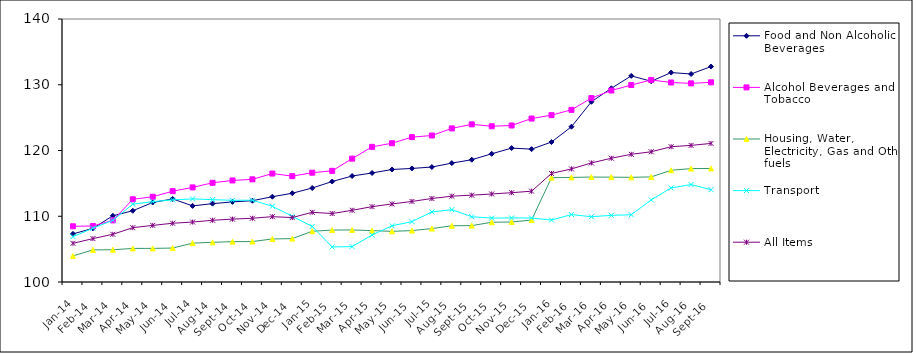
| Category | Food and Non Alcoholic Beverages | Alcohol Beverages and Tobacco | Housing, Water, Electricity, Gas and Other fuels | Transport | All Items  |
|---|---|---|---|---|---|
| 2014-01-01 | 107.321 | 108.474 | 103.967 | 106.895 | 105.878 |
| 2014-02-01 | 108.156 | 108.519 | 104.883 | 108.18 | 106.601 |
| 2014-03-01 | 110.07 | 109.373 | 104.905 | 109.388 | 107.257 |
| 2014-04-01 | 110.836 | 112.583 | 105.106 | 111.837 | 108.264 |
| 2014-05-01 | 112.095 | 112.965 | 105.114 | 112.218 | 108.608 |
| 2014-06-01 | 112.634 | 113.813 | 105.162 | 112.502 | 108.936 |
| 2014-07-01 | 111.577 | 114.387 | 105.914 | 112.638 | 109.117 |
| 2014-08-01 | 111.915 | 115.087 | 106.036 | 112.525 | 109.391 |
| 2014-09-01 | 112.185 | 115.445 | 106.136 | 112.42 | 109.563 |
| 2014-10-01 | 112.363 | 115.614 | 106.151 | 112.444 | 109.694 |
| 2014-11-01 | 112.971 | 116.497 | 106.547 | 111.515 | 109.94 |
| 2014-12-01 | 113.5 | 116.1 | 106.6 | 110 | 109.8 |
| 2015-01-01 | 114.295 | 116.625 | 107.716 | 108.446 | 110.601 |
| 2015-02-01 | 115.283 | 116.906 | 107.901 | 105.333 | 110.415 |
| 2015-03-01 | 116.12 | 118.76 | 107.917 | 105.386 | 110.906 |
| 2015-04-01 | 116.582 | 120.552 | 107.812 | 107.146 | 111.458 |
| 2015-05-01 | 117.112 | 121.107 | 107.704 | 108.548 | 111.873 |
| 2015-06-01 | 117.271 | 122.03 | 107.821 | 109.182 | 112.254 |
| 2015-07-01 | 117.484 | 122.282 | 108.124 | 110.66 | 112.699 |
| 2015-08-01 | 118.084 | 123.363 | 108.552 | 111 | 113.056 |
| 2015-09-01 | 118.596 | 123.979 | 108.577 | 109.926 | 113.205 |
| 2015-10-01 | 119.501 | 123.689 | 109.085 | 109.721 | 113.387 |
| 2015-11-01 | 120.368 | 123.804 | 109.122 | 109.744 | 113.581 |
| 2015-12-01 | 120.205 | 124.859 | 109.423 | 109.727 | 113.811 |
| 2016-01-01 | 121.29 | 125.378 | 115.867 | 109.421 | 116.507 |
| 2016-02-01 | 123.619 | 126.187 | 115.907 | 110.251 | 117.2 |
| 2016-03-01 | 127.409 | 127.97 | 115.962 | 109.932 | 118.108 |
| 2016-04-01 | 129.458 | 129.123 | 115.945 | 110.138 | 118.824 |
| 2016-05-01 | 131.348 | 129.958 | 115.918 | 110.226 | 119.421 |
| 2016-06-01 | 130.53 | 130.727 | 115.984 | 112.488 | 119.809 |
| 2016-07-01 | 131.856 | 130.344 | 116.993 | 114.308 | 120.576 |
| 2016-08-01 | 131.634 | 130.211 | 117.248 | 114.823 | 120.775 |
| 2016-09-01 | 132.768 | 130.37 | 117.267 | 114.035 | 121.078 |